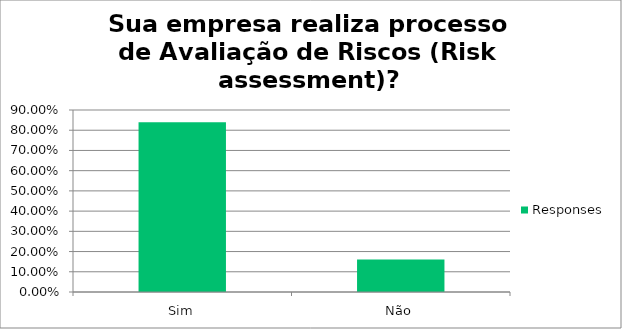
| Category | Responses |
|---|---|
| Sim | 0.839 |
| Não | 0.161 |